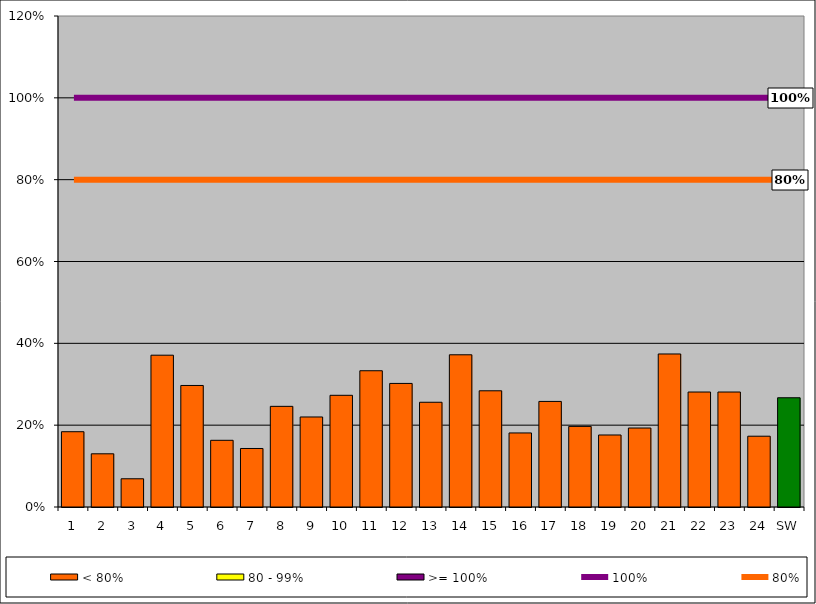
| Category | < 80% | 80 - 99% | >= 100% |
|---|---|---|---|
| 1 | 0.184 | 0 | 0 |
| 2 | 0.13 | 0 | 0 |
| 3 | 0.069 | 0 | 0 |
| 4 | 0.371 | 0 | 0 |
| 5 | 0.297 | 0 | 0 |
| 6 | 0.163 | 0 | 0 |
| 7 | 0.143 | 0 | 0 |
| 8 | 0.246 | 0 | 0 |
| 9 | 0.22 | 0 | 0 |
| 10 | 0.273 | 0 | 0 |
| 11 | 0.333 | 0 | 0 |
| 12 | 0.302 | 0 | 0 |
| 13 | 0.256 | 0 | 0 |
| 14 | 0.372 | 0 | 0 |
| 15 | 0.284 | 0 | 0 |
| 16 | 0.181 | 0 | 0 |
| 17 | 0.258 | 0 | 0 |
| 18 | 0.197 | 0 | 0 |
| 19 | 0.176 | 0 | 0 |
| 20 | 0.193 | 0 | 0 |
| 21 | 0.374 | 0 | 0 |
| 22 | 0.281 | 0 | 0 |
| 23 | 0.281 | 0 | 0 |
| 24 | 0.173 | 0 | 0 |
| SW | 0.267 | 0 | 0 |